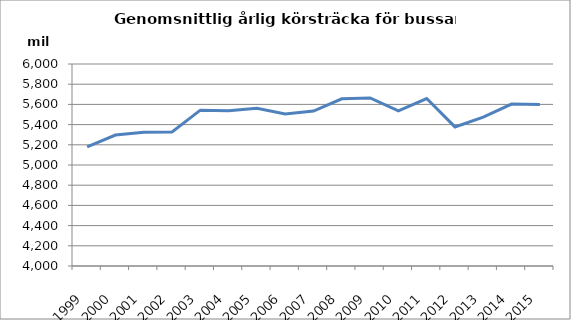
| Category | Series 0 |
|---|---|
| 1999.0 | 5178.382 |
| 2000.0 | 5296.302 |
| 2001.0 | 5324.333 |
| 2002.0 | 5326.515 |
| 2003.0 | 5542.768 |
| 2004.0 | 5537.502 |
| 2005.0 | 5561.901 |
| 2006.0 | 5504.197 |
| 2007.0 | 5534.15 |
| 2008.0 | 5655.903 |
| 2009.0 | 5663.882 |
| 2010.0 | 5535.806 |
| 2011.0 | 5658.339 |
| 2012.0 | 5376.924 |
| 2013.0 | 5474.544 |
| 2014.0 | 5603.829 |
| 2015.0 | 5599.208 |